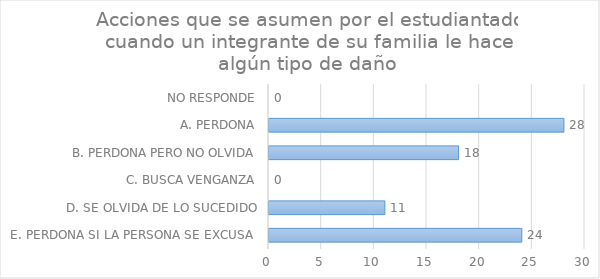
| Category | Series 0 |
|---|---|
| E. PERDONA SI LA PERSONA SE EXCUSA  | 24 |
| D. SE OLVIDA DE LO SUCEDIDO | 11 |
| C. BUSCA VENGANZA | 0 |
| B. PERDONA PERO NO OLVIDA | 18 |
| A. PERDONA | 28 |
| NO RESPONDE | 0 |